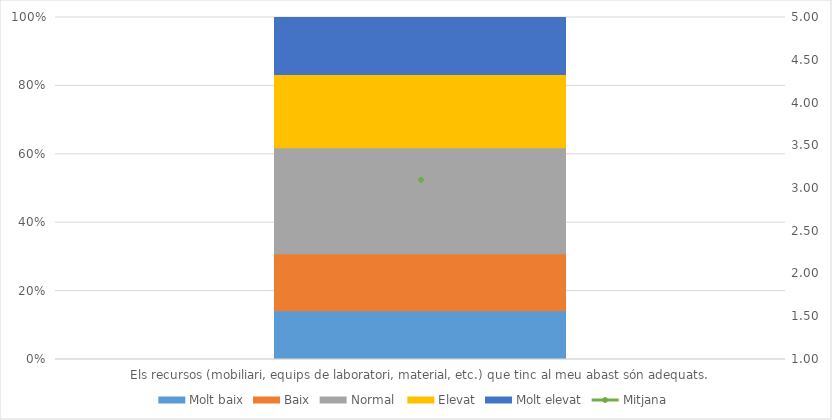
| Category | Molt baix | Baix | Normal  | Elevat | Molt elevat |
|---|---|---|---|---|---|
| Els recursos (mobiliari, equips de laboratori, material, etc.) que tinc al meu abast són adequats. | 6 | 7 | 13 | 9 | 7 |